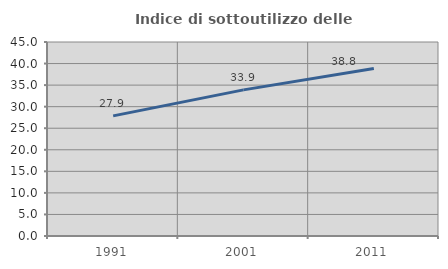
| Category | Indice di sottoutilizzo delle abitazioni  |
|---|---|
| 1991.0 | 27.859 |
| 2001.0 | 33.892 |
| 2011.0 | 38.838 |